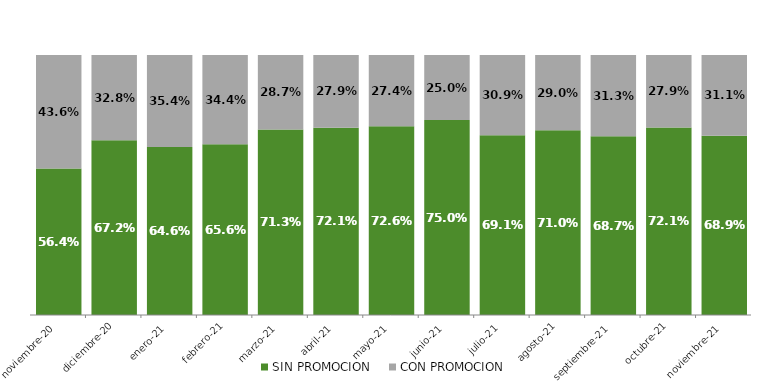
| Category | SIN PROMOCION   | CON PROMOCION   |
|---|---|---|
| 2020-11-01 | 0.564 | 0.436 |
| 2020-12-01 | 0.672 | 0.328 |
| 2021-01-01 | 0.646 | 0.354 |
| 2021-02-01 | 0.656 | 0.344 |
| 2021-03-01 | 0.713 | 0.287 |
| 2021-04-01 | 0.721 | 0.279 |
| 2021-05-01 | 0.726 | 0.274 |
| 2021-06-01 | 0.75 | 0.25 |
| 2021-07-01 | 0.691 | 0.309 |
| 2021-08-01 | 0.71 | 0.29 |
| 2021-09-01 | 0.687 | 0.313 |
| 2021-10-01 | 0.721 | 0.279 |
| 2021-11-01 | 0.689 | 0.311 |